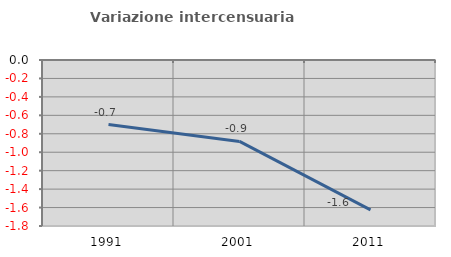
| Category | Variazione intercensuaria annua |
|---|---|
| 1991.0 | -0.7 |
| 2001.0 | -0.883 |
| 2011.0 | -1.625 |